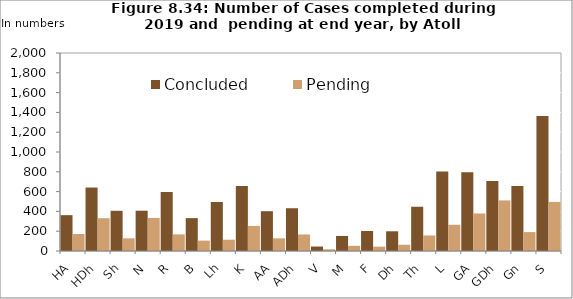
| Category | Concluded | Pending |
|---|---|---|
| HA | 362 | 172 |
| HDh | 641 | 331 |
| Sh | 406 | 128 |
| N | 407 | 334 |
| R | 596 | 168 |
| B | 332 | 105 |
| Lh | 495 | 114 |
| K | 657 | 253 |
| AA | 402 | 128 |
| ADh | 432 | 167 |
| V | 45 | 17 |
| M | 152 | 52 |
| F | 202 | 44 |
| Dh | 199 | 63 |
| Th | 447 | 157 |
| L | 802 | 265 |
| GA | 796 | 379 |
| GDh | 708 | 511 |
| Gn | 657 | 191 |
| S | 1364 | 496 |